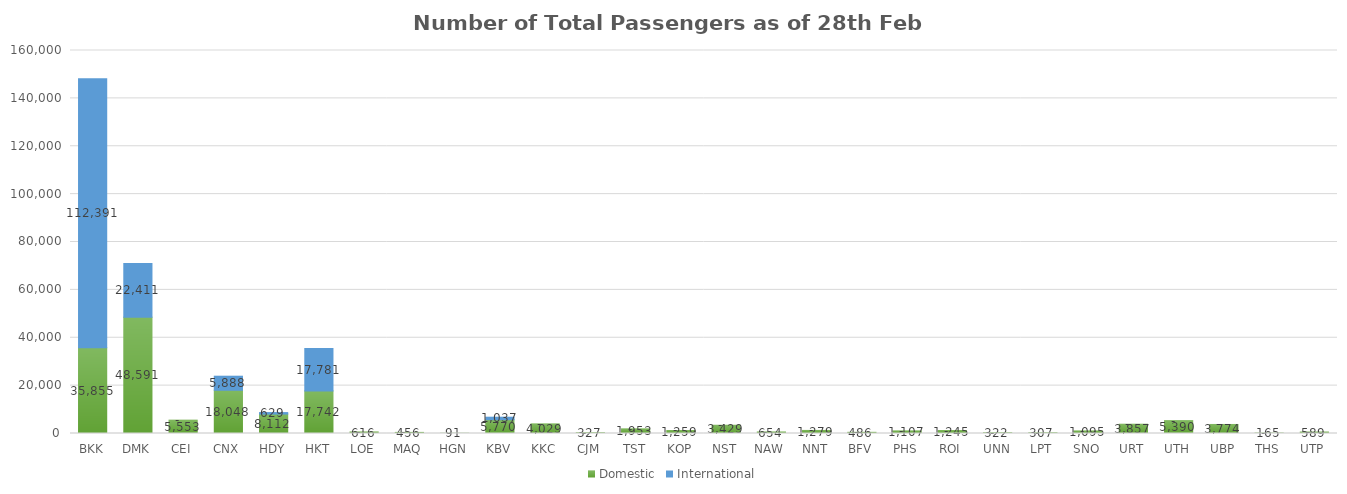
| Category | Domestic | International |
|---|---|---|
| BKK | 35855 | 112391 |
| DMK | 48591 | 22411 |
| CEI | 5553 | 0 |
| CNX | 18048 | 5888 |
| HDY | 8112 | 629 |
| HKT | 17742 | 17781 |
| LOE | 616 | 0 |
| MAQ | 456 | 0 |
| HGN | 91 | 0 |
| KBV | 5770 | 1037 |
| KKC | 4029 | 0 |
| CJM | 327 | 0 |
| TST | 1953 | 0 |
| KOP | 1259 | 0 |
| NST | 3429 | 0 |
| NAW | 654 | 0 |
| NNT | 1279 | 0 |
| BFV | 486 | 0 |
| PHS | 1107 | 0 |
| ROI | 1245 | 0 |
| UNN | 322 | 0 |
| LPT | 307 | 0 |
| SNO | 1095 | 0 |
| URT | 3857 | 0 |
| UTH | 5390 | 0 |
| UBP | 3774 | 0 |
| THS | 165 | 0 |
| UTP | 589 | 0 |